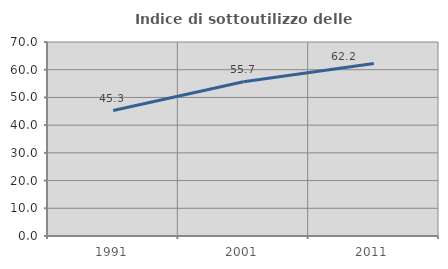
| Category | Indice di sottoutilizzo delle abitazioni  |
|---|---|
| 1991.0 | 45.267 |
| 2001.0 | 55.656 |
| 2011.0 | 62.222 |